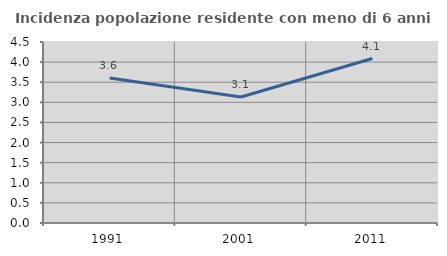
| Category | Incidenza popolazione residente con meno di 6 anni |
|---|---|
| 1991.0 | 3.604 |
| 2001.0 | 3.133 |
| 2011.0 | 4.09 |